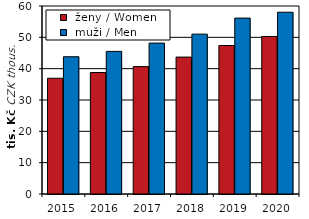
| Category |  ženy / Women |  muži / Men |
|---|---|---|
| 2015.0 | 36.944 | 43.798 |
| 2016.0 | 38.781 | 45.514 |
| 2017.0 | 40.659 | 48.158 |
| 2018.0 | 43.696 | 51.023 |
| 2019.0 | 47.392 | 56.138 |
| 2020.0 | 50.277 | 58.006 |